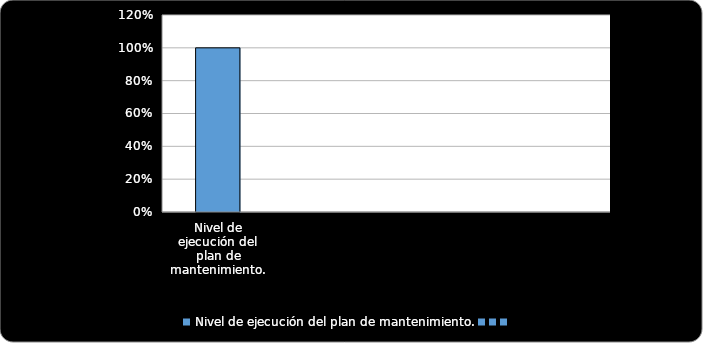
| Category | % Cumplimiento  |
|---|---|
| Nivel de ejecución del plan de mantenimiento. | 1 |